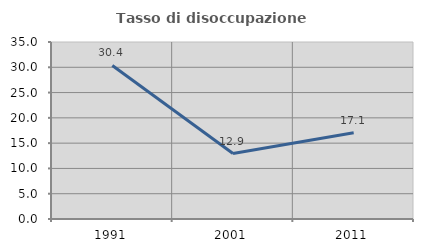
| Category | Tasso di disoccupazione giovanile  |
|---|---|
| 1991.0 | 30.357 |
| 2001.0 | 12.941 |
| 2011.0 | 17.073 |